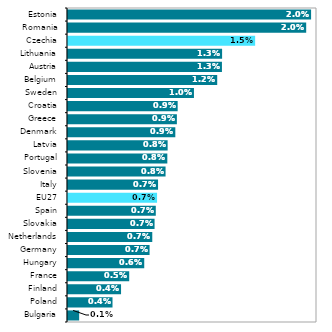
| Category |  2020* |
|---|---|
| Bulgaria | 0.001 |
| Poland | 0.004 |
| Finland | 0.004 |
| France | 0.005 |
| Hungary | 0.006 |
| Germany | 0.007 |
| Netherlands | 0.007 |
| Slovakia | 0.007 |
| Spain | 0.007 |
| EU27 | 0.007 |
| Italy | 0.007 |
| Slovenia | 0.008 |
| Portugal | 0.008 |
| Latvia | 0.008 |
| Denmark | 0.009 |
| Greece | 0.009 |
| Croatia | 0.009 |
| Sweden | 0.01 |
| Belgium | 0.012 |
| Austria | 0.013 |
| Lithuania | 0.013 |
| Czechia | 0.015 |
| Romania | 0.02 |
| Estonia | 0.02 |